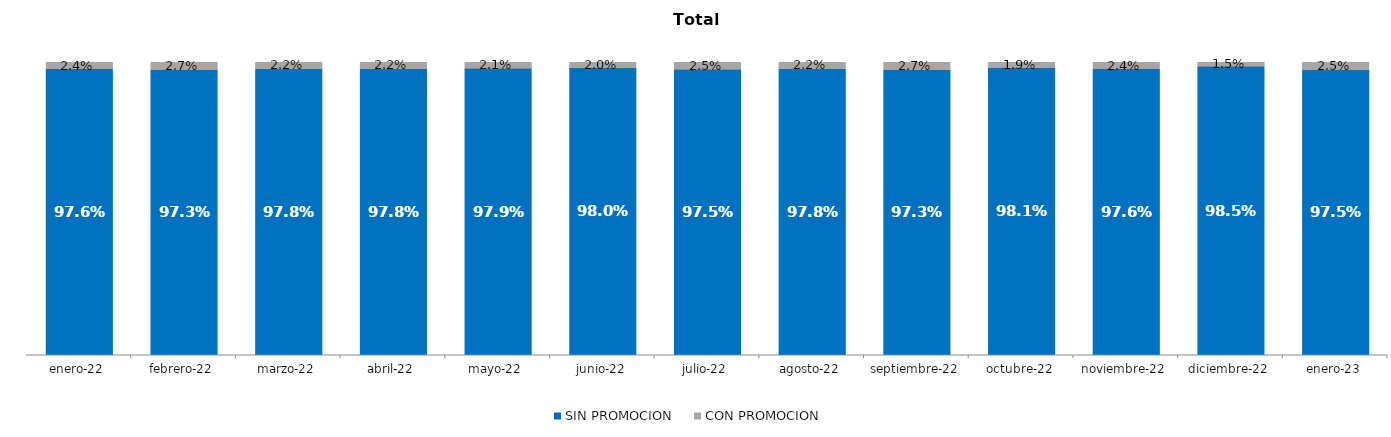
| Category | SIN PROMOCION   | CON PROMOCION   |
|---|---|---|
| 2022-01-01 | 0.976 | 0.024 |
| 2022-02-01 | 0.973 | 0.027 |
| 2022-03-01 | 0.978 | 0.022 |
| 2022-04-01 | 0.978 | 0.022 |
| 2022-05-01 | 0.979 | 0.021 |
| 2022-06-01 | 0.98 | 0.02 |
| 2022-07-01 | 0.975 | 0.025 |
| 2022-08-01 | 0.978 | 0.022 |
| 2022-09-01 | 0.973 | 0.027 |
| 2022-10-01 | 0.981 | 0.019 |
| 2022-11-01 | 0.976 | 0.024 |
| 2022-12-01 | 0.985 | 0.015 |
| 2023-01-01 | 0.975 | 0.025 |